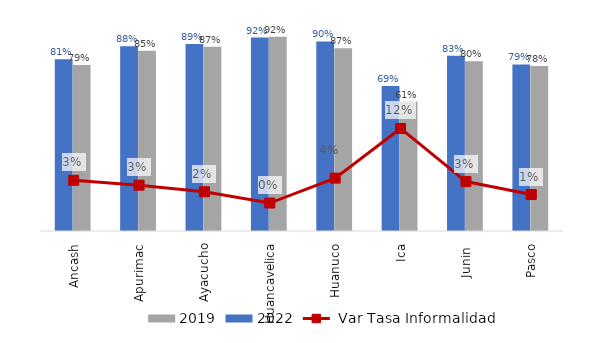
| Category | 2022 | 2019 |
|---|---|---|
| Ancash | 0.814 | 0.787 |
| Apurimac | 0.876 | 0.854 |
| Ayacucho | 0.886 | 0.873 |
| Huancavelica | 0.917 | 0.92 |
| Huanuco | 0.899 | 0.866 |
| Ica | 0.687 | 0.614 |
| Junin  | 0.83 | 0.805 |
| Pasco | 0.79 | 0.781 |